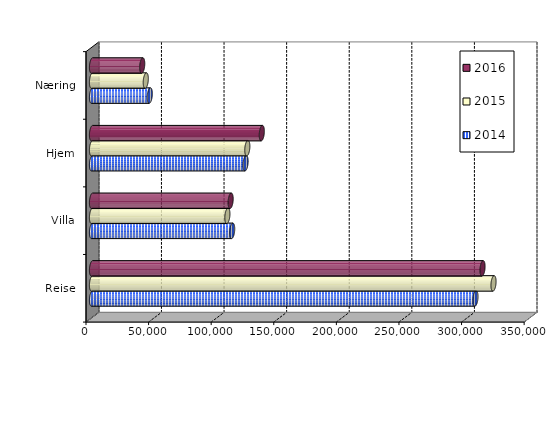
| Category | 2014 | 2015 | 2016 |
|---|---|---|---|
| Reise | 306308 | 320739 | 311962 |
| Villa | 111974 | 108145.685 | 110745.204 |
| Hjem | 122672 | 124066.909 | 135636.54 |
| Næring | 46146 | 42956.936 | 40113.599 |